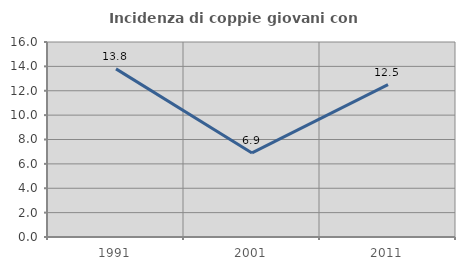
| Category | Incidenza di coppie giovani con figli |
|---|---|
| 1991.0 | 13.793 |
| 2001.0 | 6.897 |
| 2011.0 | 12.5 |